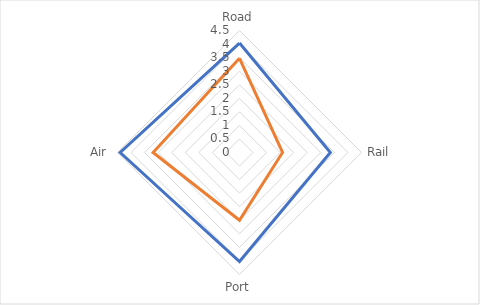
| Category | Global Average | Uganda |
|---|---|---|
| Road | 4.037 | 3.476 |
| Rail | 3.351 | 1.588 |
| Port | 4.022 | 2.5 |
| Air | 4.401 | 3.188 |